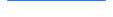
| Category | Series 0 |
|---|---|
| 0 | 97 |
| 1 | 70 |
| 2 | 77 |
| 3 | 50 |
| 4 | 51 |
| 5 | 66 |
| 6 | 74 |
| 7 | 52 |
| 8 | 56 |